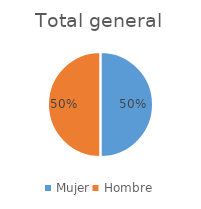
| Category | Total general |
|---|---|
| Mujer | 0.5 |
| Hombre | 0.5 |